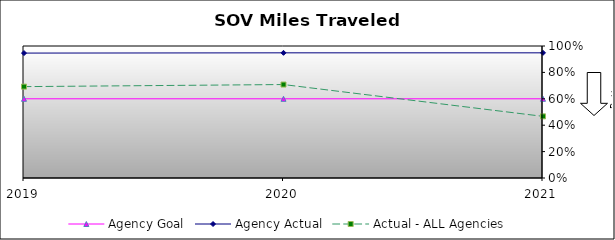
| Category | Agency Goal | Agency Actual | Actual - ALL Agencies |
|---|---|---|---|
| 2019.0 | 0.6 | 0.946 | 0.692 |
| 2020.0 | 0.6 | 0.948 | 0.708 |
| 2021.0 | 0.6 | 0.948 | 0.467 |